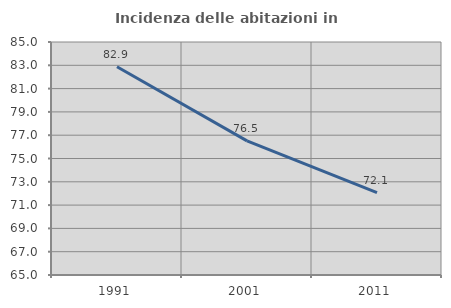
| Category | Incidenza delle abitazioni in proprietà  |
|---|---|
| 1991.0 | 82.875 |
| 2001.0 | 76.514 |
| 2011.0 | 72.063 |